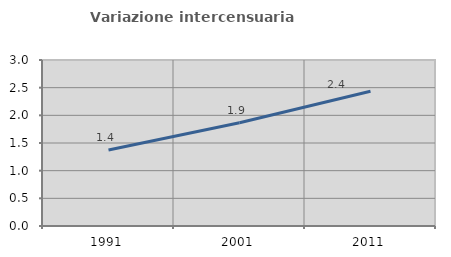
| Category | Variazione intercensuaria annua |
|---|---|
| 1991.0 | 1.374 |
| 2001.0 | 1.865 |
| 2011.0 | 2.435 |